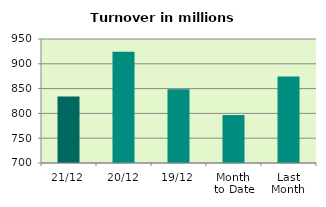
| Category | Series 0 |
|---|---|
| 21/12 | 833.967 |
| 20/12 | 924.259 |
| 19/12 | 848.865 |
| Month 
to Date | 796.872 |
| Last
Month | 874.327 |